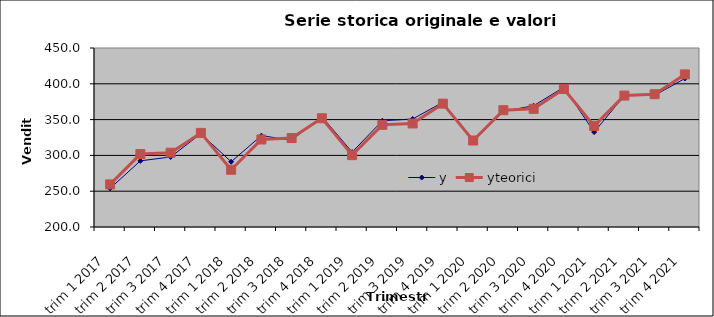
| Category | y | yteorici |
|---|---|---|
| trim 1 2017 | 254 | 259.51 |
| trim 2 2017 | 292.4 | 301.83 |
| trim 3 2017 | 297.8 | 303.75 |
| trim 4 2017 | 330.3 | 331.43 |
| trim 1 2018 | 291.1 | 279.935 |
| trim 2 2018 | 327.6 | 322.255 |
| trim 3 2018 | 321.2 | 324.175 |
| trim 4 2018 | 354.3 | 351.855 |
| trim 1 2019 | 304.6 | 300.36 |
| trim 2 2019 | 348.4 | 342.68 |
| trim 3 2019 | 350.8 | 344.6 |
| trim 4 2019 | 374.2 | 372.28 |
| trim 1 2020 | 319.5 | 320.785 |
| trim 2 2020 | 361.5 | 363.105 |
| trim 3 2020 | 369.4 | 365.025 |
| trim 4 2020 | 395.2 | 392.705 |
| trim 1 2021 | 332.6 | 341.21 |
| trim 2 2021 | 383.5 | 383.53 |
| trim 3 2021 | 383.8 | 385.45 |
| trim 4 2021 | 407.4 | 413.13 |